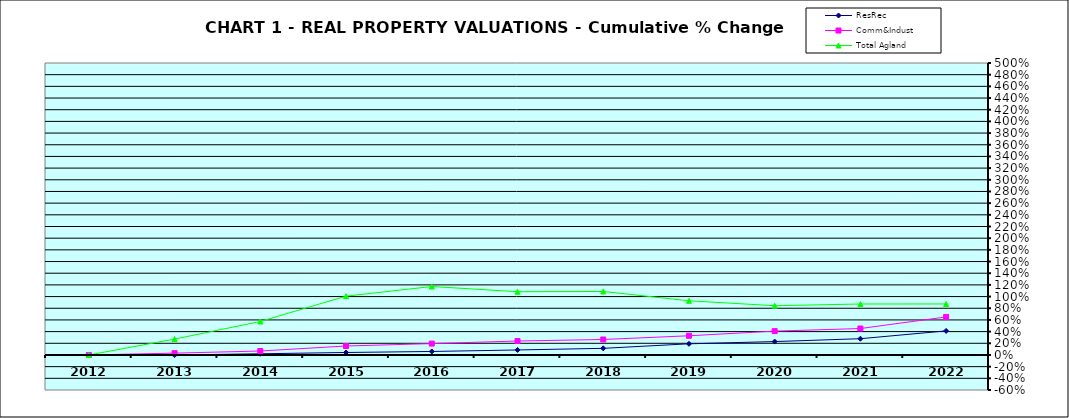
| Category | ResRec | Comm&Indust | Total Agland |
|---|---|---|---|
| 2012.0 | 0 | 0 | 0 |
| 2013.0 | -0.001 | 0.031 | 0.272 |
| 2014.0 | 0.02 | 0.068 | 0.574 |
| 2015.0 | 0.042 | 0.153 | 1.007 |
| 2016.0 | 0.06 | 0.195 | 1.172 |
| 2017.0 | 0.086 | 0.239 | 1.083 |
| 2018.0 | 0.113 | 0.265 | 1.087 |
| 2019.0 | 0.191 | 0.329 | 0.928 |
| 2020.0 | 0.229 | 0.408 | 0.844 |
| 2021.0 | 0.279 | 0.453 | 0.873 |
| 2022.0 | 0.412 | 0.651 | 0.873 |